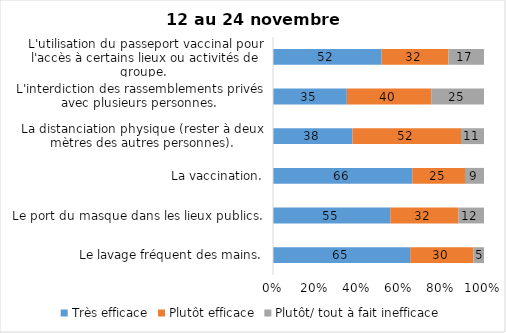
| Category | Très efficace | Plutôt efficace | Plutôt/ tout à fait inefficace |
|---|---|---|---|
| Le lavage fréquent des mains. | 65 | 30 | 5 |
| Le port du masque dans les lieux publics. | 55 | 32 | 12 |
| La vaccination. | 66 | 25 | 9 |
| La distanciation physique (rester à deux mètres des autres personnes). | 38 | 52 | 11 |
| L'interdiction des rassemblements privés avec plusieurs personnes. | 35 | 40 | 25 |
| L'utilisation du passeport vaccinal pour l'accès à certains lieux ou activités de groupe.  | 52 | 32 | 17 |